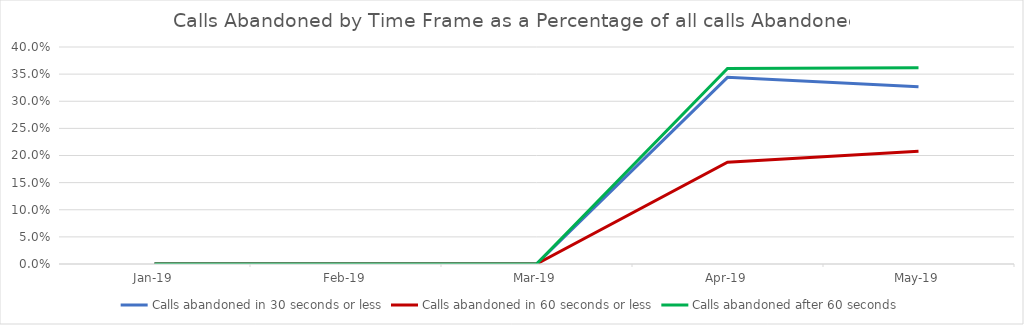
| Category | Calls abandoned in 30 seconds or less | Calls abandoned in 60 seconds or less | Calls abandoned after 60 seconds |
|---|---|---|---|
| 2019-01-01 | 0 | 0 | 0 |
| 2019-02-01 | 0 | 0 | 0 |
| 2019-03-01 | 0 | 0 | 0 |
| 2019-04-01 | 0.344 | 0.188 | 0.36 |
| 2019-05-01 | 0.327 | 0.208 | 0.362 |